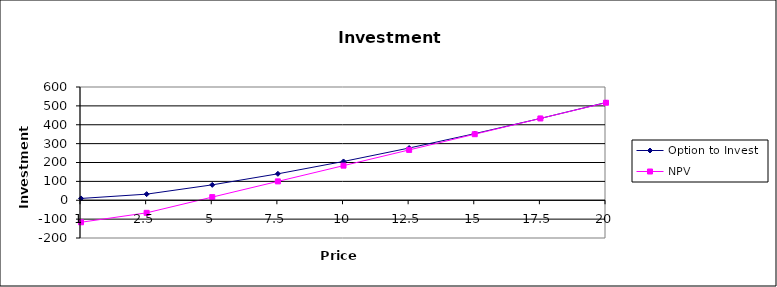
| Category | Option to Invest | NPV |
|---|---|---|
| 1.0 | 9.539 | -116.667 |
| 2.5 | 32.367 | -66.667 |
| 5.0 | 81.56 | 16.667 |
| 7.5 | 140.044 | 100 |
| 10.0 | 205.518 | 183.333 |
| 12.5 | 276.734 | 266.667 |
| 15.0 | 352.889 | 350 |
| 17.5 | 433.411 | 433.333 |
| 20.0 | 517.872 | 516.667 |